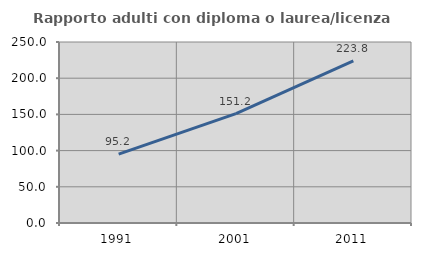
| Category | Rapporto adulti con diploma o laurea/licenza media  |
|---|---|
| 1991.0 | 95.215 |
| 2001.0 | 151.165 |
| 2011.0 | 223.773 |